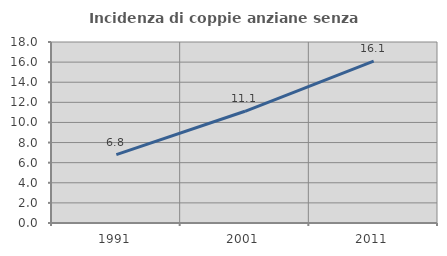
| Category | Incidenza di coppie anziane senza figli  |
|---|---|
| 1991.0 | 6.803 |
| 2001.0 | 11.109 |
| 2011.0 | 16.1 |